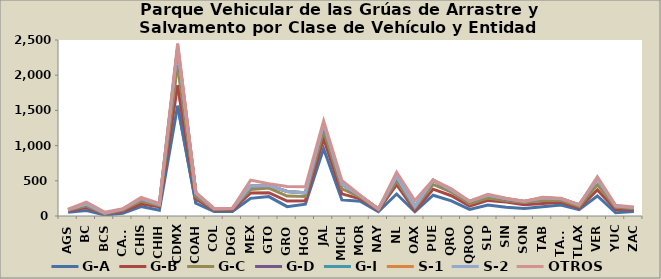
| Category | G-A | G-B | G-C | G-D | G-I | S-1 | S-2 | OTROS |
|---|---|---|---|---|---|---|---|---|
| AGS | 53 | 17 | 11 | 8 | 1 | 0 | 0 | 6 |
| BC | 79 | 42 | 23 | 22 | 1 | 0 | 1 | 30 |
| BCS | 15 | 10 | 4 | 3 | 7 | 0 | 0 | 16 |
| CAMP | 38 | 28 | 18 | 13 | 1 | 0 | 0 | 5 |
| CHIS | 134 | 36 | 43 | 34 | 0 | 0 | 0 | 16 |
| CHIH | 82 | 49 | 15 | 17 | 0 | 0 | 0 | 17 |
| CDMX | 1565 | 297 | 282 | 225 | 20 | 0 | 1 | 59 |
| COAH | 181 | 61 | 33 | 36 | 8 | 0 | 0 | 18 |
| COL | 64 | 18 | 11 | 9 | 0 | 0 | 0 | 5 |
| DGO | 64 | 20 | 18 | 6 | 0 | 0 | 0 | 2 |
| MEX | 251 | 76 | 50 | 44 | 5 | 0 | 0 | 84 |
| GTO | 276 | 55 | 65 | 36 | 1 | 0 | 0 | 24 |
| GRO | 133 | 79 | 72 | 64 | 1 | 0 | 0 | 69 |
| HGO | 167 | 51 | 58 | 51 | 2 | 0 | 0 | 85 |
| JAL | 957 | 143 | 109 | 94 | 7 | 0 | 0 | 40 |
| MICH | 229 | 86 | 72 | 65 | 0 | 0 | 2 | 51 |
| MOR | 210 | 34 | 24 | 18 | 0 | 0 | 0 | 10 |
| NAY | 61 | 20 | 11 | 8 | 0 | 0 | 0 | 0 |
| NL | 312 | 133 | 50 | 50 | 12 | 0 | 2 | 61 |
| OAX | 60 | 16 | 37 | 20 | 1 | 0 | 0 | 86 |
| PUE | 295 | 86 | 67 | 58 | 2 | 1 | 2 | 4 |
| QRO | 215 | 73 | 53 | 23 | 2 | 0 | 0 | 19 |
| QROO | 93 | 48 | 33 | 32 | 1 | 0 | 0 | 4 |
| SLP | 155 | 66 | 35 | 37 | 1 | 0 | 0 | 14 |
| SIN | 123 | 75 | 19 | 19 | 9 | 0 | 0 | 7 |
| SON | 107 | 53 | 31 | 16 | 0 | 0 | 0 | 4 |
| TAB | 130 | 48 | 41 | 36 | 1 | 0 | 0 | 9 |
| TAMS | 157 | 39 | 26 | 22 | 1 | 0 | 1 | 7 |
| TLAX | 91 | 21 | 23 | 23 | 0 | 0 | 0 | 2 |
| VER | 285 | 84 | 73 | 83 | 1 | 0 | 0 | 31 |
| YUC | 47 | 45 | 32 | 14 | 2 | 0 | 0 | 13 |
| ZAC | 65 | 23 | 17 | 14 | 0 | 0 | 2 | 6 |